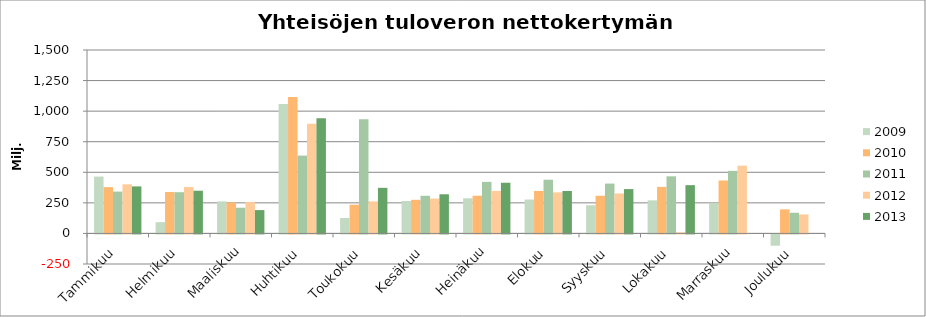
| Category | 2009 | 2010 | 2011 | 2012 | 2013 |
|---|---|---|---|---|---|
| Tammikuu | 464.899 | 378.86 | 341.987 | 401.627 | 384.485 |
| Helmikuu | 92.021 | 339.045 | 337.078 | 379.401 | 349.199 |
| Maaliskuu | 261.783 | 253.057 | 210.203 | 256.28 | 190.945 |
| Huhtikuu | 1059.201 | 1115.624 | 636.437 | 897.203 | 940.935 |
| Toukokuu | 126.163 | 234.756 | 933.434 | 262.244 | 372.901 |
| Kesäkuu | 265.105 | 274.88 | 307.856 | 285.13 | 320.319 |
| Heinäkuu | 286.978 | 308.391 | 421.522 | 347.389 | 414.27 |
| Elokuu | 277.363 | 347.548 | 439.399 | 335.795 | 347.137 |
| Syyskuu | 230.468 | 308.333 | 407.65 | 326.578 | 362.569 |
| Lokakuu | 270.56 | 380.508 | 466.894 | 9.04 | 394.905 |
| Marraskuu | 249.968 | 432.891 | 511.438 | 554.296 | 0 |
| Joulukuu | -92.536 | 196.924 | 169.141 | 155.44 | 0 |